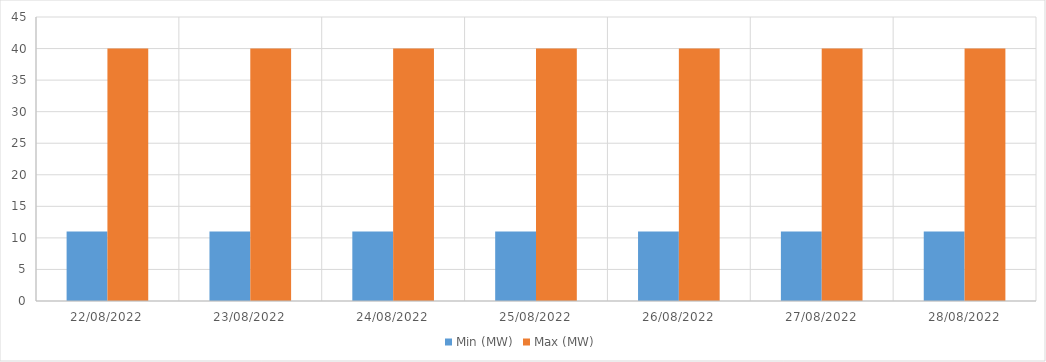
| Category | Min (MW) | Max (MW) |
|---|---|---|
| 22/08/2022 | 11 | 40 |
| 23/08/2022 | 11 | 40 |
| 24/08/2022 | 11 | 40 |
| 25/08/2022 | 11 | 40 |
| 26/08/2022 | 11 | 40 |
| 27/08/2022 | 11 | 40 |
| 28/08/2022 | 11 | 40 |